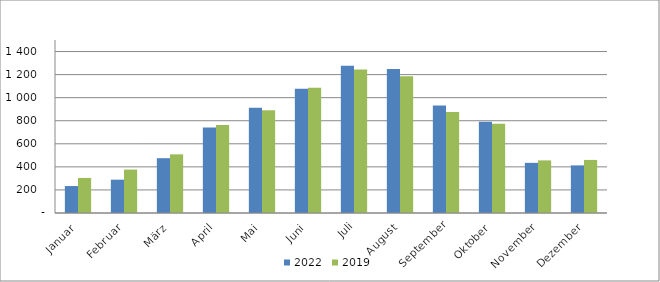
| Category | 2022 | 2019 |
|---|---|---|
| Januar | 233736 | 304091 |
| Februar | 288901 | 376664 |
| März | 475154 | 508668 |
| April | 742233 | 762762 |
| Mai | 913016 | 891354 |
| Juni | 1077843 | 1086638 |
| Juli | 1277761 | 1244103 |
| August | 1248547 | 1184768 |
| September | 931669 | 875331 |
| Oktober | 792262 | 773129 |
| November | 434868 | 456199 |
| Dezember | 412847 | 460123 |